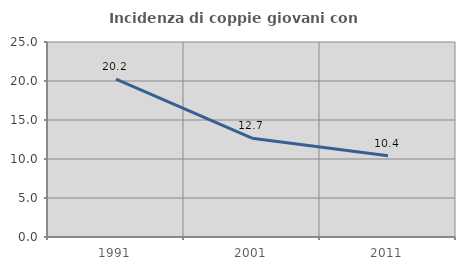
| Category | Incidenza di coppie giovani con figli |
|---|---|
| 1991.0 | 20.243 |
| 2001.0 | 12.674 |
| 2011.0 | 10.416 |